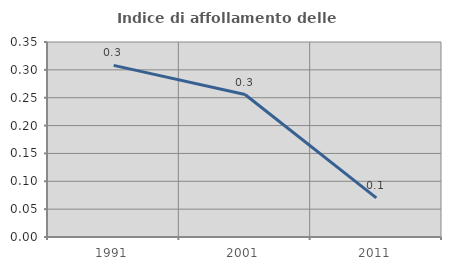
| Category | Indice di affollamento delle abitazioni  |
|---|---|
| 1991.0 | 0.308 |
| 2001.0 | 0.256 |
| 2011.0 | 0.07 |